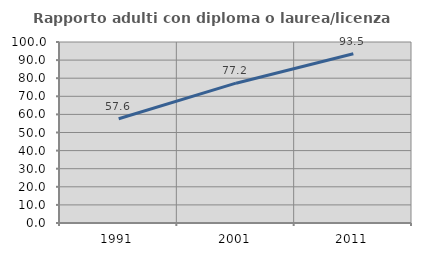
| Category | Rapporto adulti con diploma o laurea/licenza media  |
|---|---|
| 1991.0 | 57.617 |
| 2001.0 | 77.249 |
| 2011.0 | 93.526 |